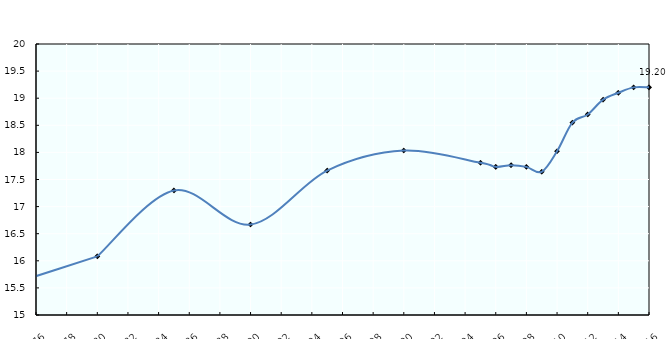
| Category | Unweighted average |
|---|---|
| 1975.0 | 15.627 |
| 1980.0 | 16.082 |
| 1985.0 | 17.298 |
| 1990.0 | 16.669 |
| 1995.0 | 17.665 |
| 2000.0 | 18.034 |
| 2005.0 | 17.809 |
| 2006.0 | 17.733 |
| 2007.0 | 17.764 |
| 2008.0 | 17.733 |
| 2009.0 | 17.642 |
| 2010.0 | 18.021 |
| 2011.0 | 18.548 |
| 2012.0 | 18.7 |
| 2013.0 | 18.973 |
| 2014.0 | 19.1 |
| 2015.0 | 19.2 |
| 2016.0 | 19.2 |